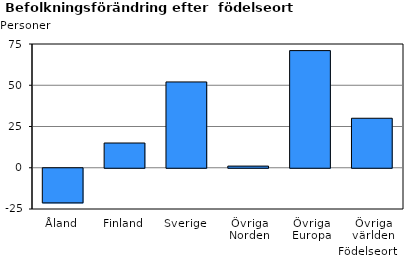
| Category | Series 0 |
|---|---|
| Åland | -21 |
| Finland | 15 |
| Sverige | 52 |
| Övriga Norden | 1 |
| Övriga Europa | 71 |
| Övriga världen | 30 |